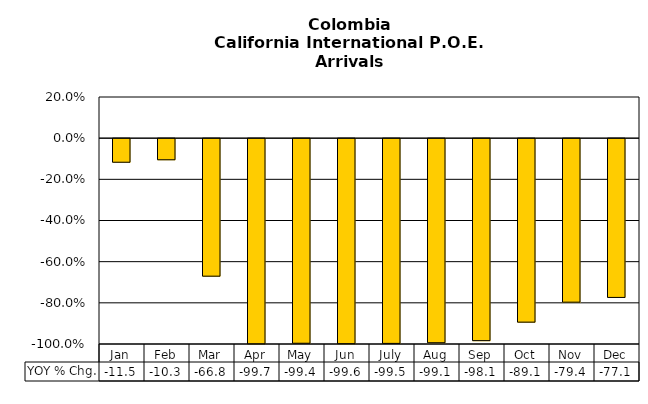
| Category | YOY % Chg. |
|---|---|
| Jan | -0.115 |
| Feb | -0.103 |
| Mar | -0.668 |
| Apr | -0.997 |
| May | -0.994 |
| Jun | -0.996 |
| July | -0.995 |
| Aug | -0.991 |
| Sep | -0.981 |
| Oct | -0.891 |
| Nov | -0.794 |
| Dec | -0.771 |